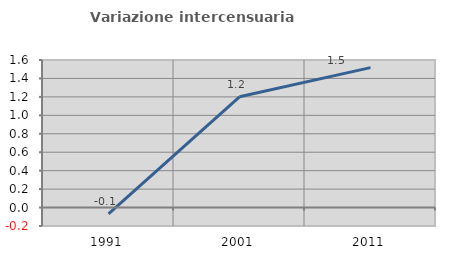
| Category | Variazione intercensuaria annua |
|---|---|
| 1991.0 | -0.068 |
| 2001.0 | 1.201 |
| 2011.0 | 1.517 |